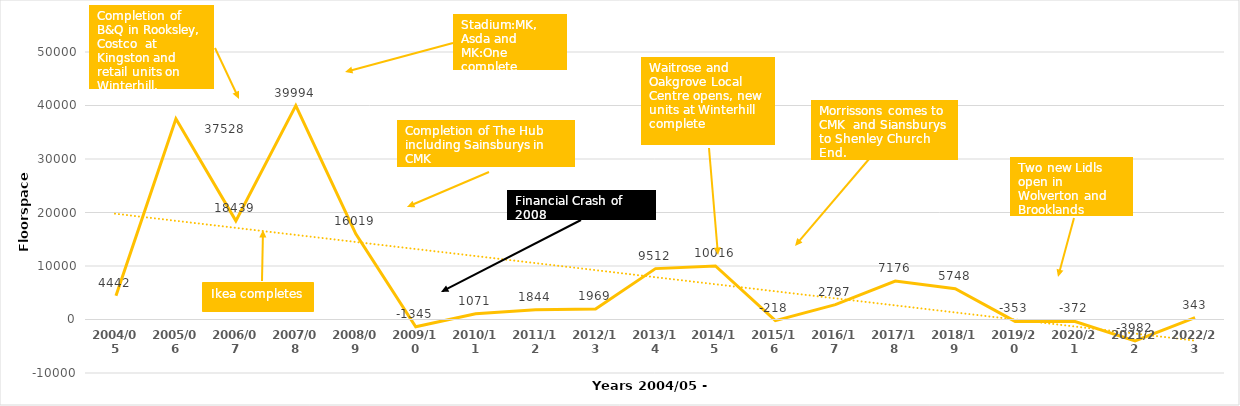
| Category | Series 0 |
|---|---|
| 2004/05 | 4442 |
| 2005/06 | 37528 |
| 2006/07 | 18439 |
| 2007/08 | 39994 |
| 2008/09 | 16019 |
| 2009/10 | -1345 |
| 2010/11 | 1071 |
| 2011/12 | 1844 |
| 2012/13 | 1969 |
| 2013/14 | 9512 |
| 2014/15 | 10016 |
| 2015/16 | -218 |
| 2016/17 | 2787 |
| 2017/18 | 7176 |
| 2018/19 | 5748 |
| 2019/20 | -353 |
| 2020/21 | -372 |
| 2021/22 | -3982 |
| 2022/23 | 343 |